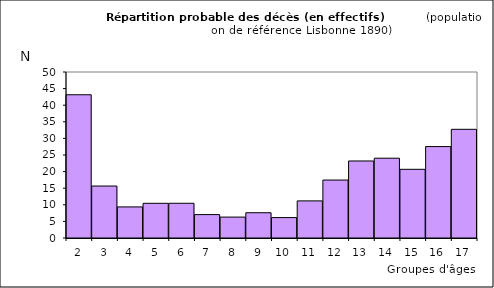
| Category | Series 0 |
|---|---|
| 2.0 | 43.145 |
| 3.0 | 15.652 |
| 4.0 | 9.363 |
| 5.0 | 10.444 |
| 6.0 | 10.46 |
| 7.0 | 7.047 |
| 8.0 | 6.301 |
| 9.0 | 7.612 |
| 10.0 | 6.149 |
| 11.0 | 11.18 |
| 12.0 | 17.452 |
| 13.0 | 23.199 |
| 14.0 | 24.034 |
| 15.0 | 20.687 |
| 16.0 | 27.54 |
| 17.0 | 32.734 |